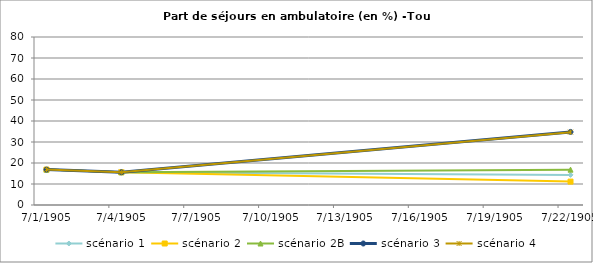
| Category | scénario 1 | scénario 2 | scénario 2B | scénario 3 | scénario 4 |
|---|---|---|---|---|---|
| 2009.0 | 16.862 | 16.862 | 16.862 | 16.862 | 16.862 |
| 2012.0 | 15.587 | 15.587 | 15.587 | 15.587 | 15.587 |
| 2030.0 | 14.334 | 11.136 | 16.836 | 34.8 | 34.7 |